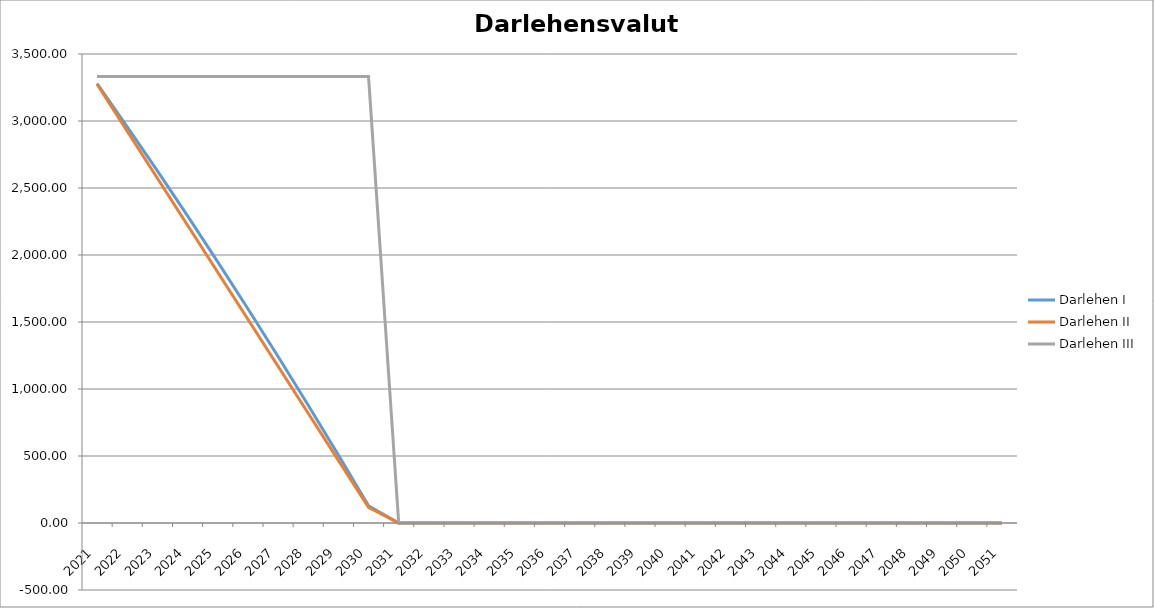
| Category | Darlehen I | Darlehen II | Darlehen III |
|---|---|---|---|
| 2021-01-01 | 3279.813 | 3274.526 | 3333 |
| 2022-01-01 | 2956.942 | 2923.684 | 3333 |
| 2023-01-01 | 2627.554 | 2572.842 | 3333 |
| 2024-01-01 | 2291.517 | 2222 | 3333 |
| 2025-01-01 | 1948.698 | 1871.158 | 3333 |
| 2026-01-01 | 1598.959 | 1520.316 | 3333 |
| 2027-01-01 | 1242.161 | 1169.474 | 3333 |
| 2028-01-01 | 878.162 | 818.632 | 3333 |
| 2029-01-01 | 506.815 | 467.789 | 3333 |
| 2030-01-01 | 127.972 | 116.947 | 3333 |
| 2031-01-01 | 0 | 0 | 0 |
| 2032-01-01 | 0 | 0 | 0 |
| 2033-01-01 | 0 | 0 | 0 |
| 2034-01-01 | 0 | 0 | 0 |
| 2035-01-01 | 0 | 0 | 0 |
| 2036-01-01 | 0 | 0 | 0 |
| 2037-01-01 | 0 | 0 | 0 |
| 2038-01-01 | 0 | 0 | 0 |
| 2039-01-01 | 0 | 0 | 0 |
| 2040-01-01 | 0 | 0 | 0 |
| 2041-01-01 | 0 | 0 | 0 |
| 2042-01-01 | 0 | 0 | 0 |
| 2043-01-01 | 0 | 0 | 0 |
| 2044-01-01 | 0 | 0 | 0 |
| 2045-01-01 | 0 | 0 | 0 |
| 2046-01-01 | 0 | 0 | 0 |
| 2047-01-01 | 0 | 0 | 0 |
| 2048-01-01 | 0 | 0 | 0 |
| 2049-01-01 | 0 | 0 | 0 |
| 2050-01-01 | 0 | 0 | 0 |
| 2051-01-01 | 0 | 0 | 0 |